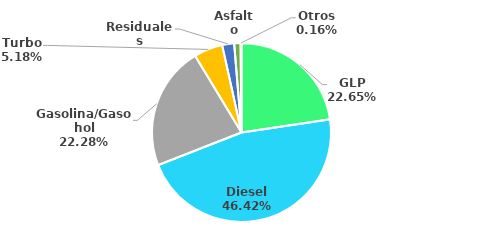
| Category | MBPD |
|---|---|
| GLP | 63.566 |
| Diesel | 130.291 |
| Gasolina/Gasohol | 62.523 |
| Turbo | 14.536 |
| Residuales | 6.08 |
| Asfalto | 3.229 |
| Otros | 0.448 |